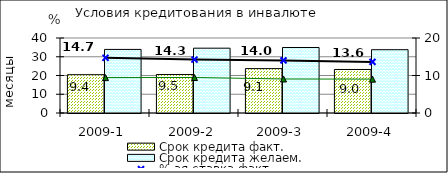
| Category | Срок кредита факт.  | Срок кредита желаем. |
|---|---|---|
| 2009-1 | 20.43 | 33.91 |
| 2009-2 | 20.51 | 34.57 |
| 2009-3 | 23.67 | 34.93 |
| 2009-4 | 23.21 | 33.76 |